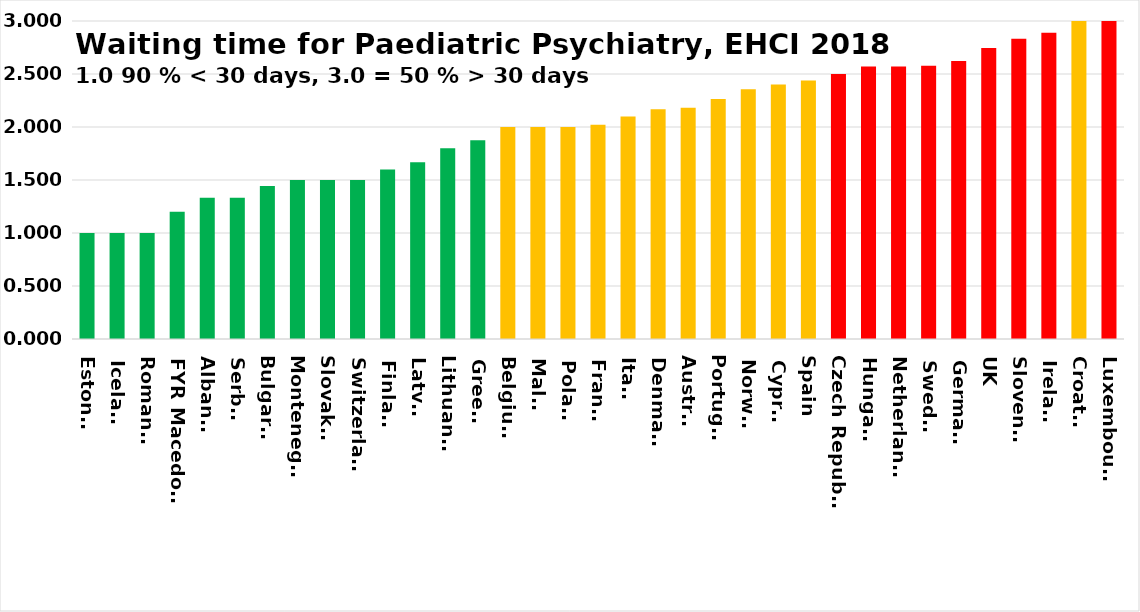
| Category | Series 0 |
|---|---|
| Estonia | 1 |
| Iceland | 1 |
| Romania | 1 |
| FYR Macedonia | 1.2 |
| Albania | 1.333 |
| Serbia | 1.333 |
| Bulgaria | 1.444 |
| Montenegro | 1.5 |
| Slovakia | 1.5 |
| Switzerland | 1.5 |
| Finland | 1.6 |
| Latvia | 1.667 |
| Lithuania | 1.8 |
| Greece | 1.875 |
| Belgium | 2 |
| Malta | 2 |
| Poland | 2 |
| France | 2.021 |
| Italy | 2.099 |
| Denmark | 2.167 |
| Austria | 2.182 |
| Portugal | 2.263 |
| Norway | 2.357 |
| Cyprus | 2.4 |
| Spain | 2.438 |
| Czech Republic | 2.5 |
| Hungary | 2.571 |
| Netherlands | 2.571 |
| Sweden | 2.577 |
| Germany | 2.622 |
| UK | 2.746 |
| Slovenia | 2.833 |
| Ireland | 2.889 |
| Croatia | 3 |
| Luxembourg | 3 |